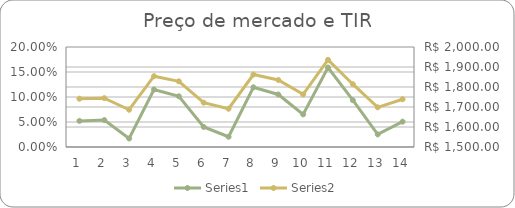
| Category | Series 0 |
|---|---|
| 0 | 0.052 |
| 1 | 0.054 |
| 2 | 0.017 |
| 3 | 0.115 |
| 4 | 0.101 |
| 5 | 0.04 |
| 6 | 0.02 |
| 7 | 0.119 |
| 8 | 0.105 |
| 9 | 0.065 |
| 10 | 0.159 |
| 11 | 0.094 |
| 12 | 0.025 |
| 13 | 0.051 |